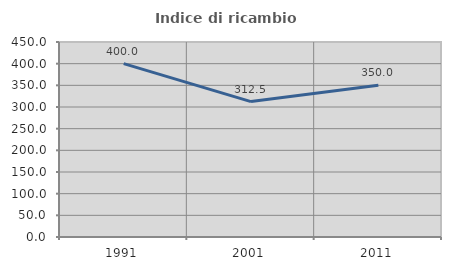
| Category | Indice di ricambio occupazionale  |
|---|---|
| 1991.0 | 400 |
| 2001.0 | 312.5 |
| 2011.0 | 350 |